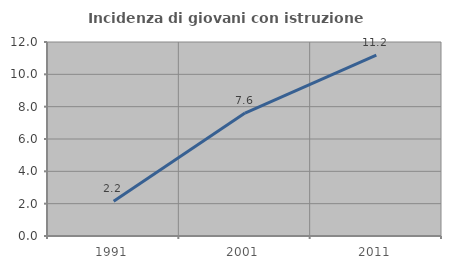
| Category | Incidenza di giovani con istruzione universitaria |
|---|---|
| 1991.0 | 2.154 |
| 2001.0 | 7.601 |
| 2011.0 | 11.181 |